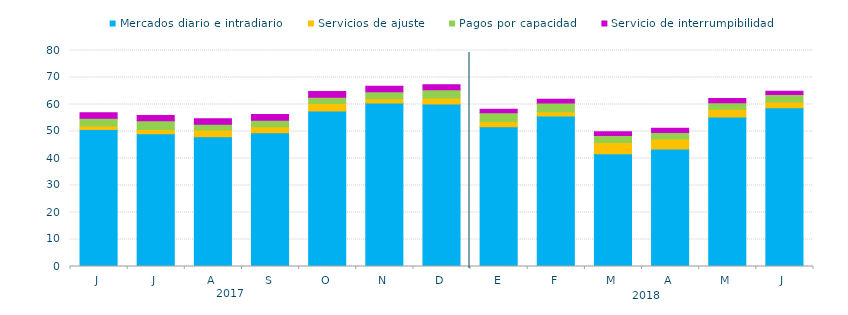
| Category | Mercados diario e intradiario  | Servicios de ajuste | Pagos por capacidad | Servicio de interrumpibilidad |
|---|---|---|---|---|
| J | 50.77 | 1.25 | 2.91 | 2 |
| J | 49.13 | 1.65 | 3.22 | 1.93 |
| A | 48.03 | 2.5 | 2.18 | 1.99 |
| S | 49.52 | 2.2 | 2.42 | 2.14 |
| O | 57.56 | 2.77 | 2.35 | 2.15 |
| N | 60.56 | 1.68 | 2.49 | 2.07 |
| D | 60.14 | 2.25 | 3.07 | 1.85 |
| E | 51.77 | 1.96 | 3.19 | 1.36 |
| F | 55.76 | 1.57 | 3.18 | 1.44 |
| M | 41.75 | 4.21 | 2.56 | 1.41 |
| A | 43.51 | 3.68 | 2.43 | 1.56 |
| M | 55.4 | 2.88 | 2.37 | 1.53 |
| J | 58.79 | 2.1 | 2.85 | 1.13 |